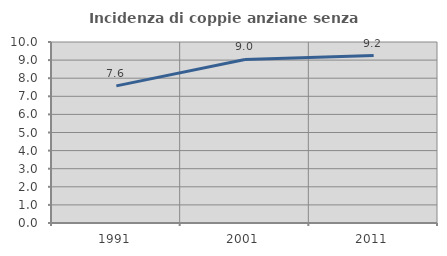
| Category | Incidenza di coppie anziane senza figli  |
|---|---|
| 1991.0 | 7.576 |
| 2001.0 | 9.036 |
| 2011.0 | 9.249 |